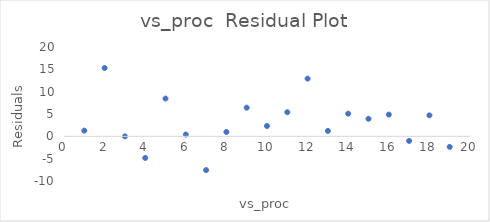
| Category | Series 0 |
|---|---|
| 0 | 1.267 |
| 1 | 15.292 |
| 2 | -0.004 |
| 3 | -4.838 |
| 4 | 8.461 |
| 5 | 0.406 |
| 6 | -7.557 |
| 7 | 0.977 |
| 8 | 6.416 |
| 9 | 2.316 |
| 10 | 5.403 |
| 11 | 12.918 |
| 12 | 1.216 |
| 13 | 5.071 |
| 14 | 3.928 |
| 15 | 4.869 |
| 16 | -1.017 |
| 17 | 4.699 |
| 18 | -2.366 |
| 19 | 8.168 |
| 20 | -16.393 |
| 21 | 6.189 |
| 22 | 11.513 |
| 23 | -1.577 |
| 24 | 5.841 |
| 25 | 10.309 |
| 26 | 4.587 |
| 27 | 3.82 |
| 28 | 0.775 |
| 29 | 11.954 |
| 30 | -0.415 |
| 31 | 9.138 |
| 32 | -8.422 |
| 33 | 1.537 |
| 34 | 3.233 |
| 35 | -6.567 |
| 36 | 12.716 |
| 37 | -0.663 |
| 38 | 1.883 |
| 39 | -1.22 |
| 40 | 11.537 |
| 41 | 7.772 |
| 42 | 6.327 |
| 43 | 0.132 |
| 44 | 1.859 |
| 45 | 5.192 |
| 46 | -4.631 |
| 47 | 7.261 |
| 48 | 4.036 |
| 49 | 13.141 |
| 50 | -6.839 |
| 51 | 4.633 |
| 52 | 7.245 |
| 53 | 1.591 |
| 54 | 9.561 |
| 55 | 3.293 |
| 56 | 12.322 |
| 57 | -13.358 |
| 58 | -17.142 |
| 59 | -2.834 |
| 60 | 0.723 |
| 61 | -2.875 |
| 62 | -4.661 |
| 63 | 3.18 |
| 64 | -6.265 |
| 65 | -3.186 |
| 66 | 4.661 |
| 67 | -0.001 |
| 68 | -7.832 |
| 69 | -10.403 |
| 70 | -12.019 |
| 71 | 1.246 |
| 72 | -6.517 |
| 73 | -7.326 |
| 74 | -0.567 |
| 75 | 8.21 |
| 76 | -2.295 |
| 77 | 1.416 |
| 78 | -4.326 |
| 79 | -4.394 |
| 80 | 14.023 |
| 81 | -7.789 |
| 82 | -3.364 |
| 83 | 7.16 |
| 84 | -2.409 |
| 85 | 6.465 |
| 86 | 0.104 |
| 87 | 11.134 |
| 88 | 1.918 |
| 89 | 4.078 |
| 90 | -0.038 |
| 91 | 2.564 |
| 92 | 4.352 |
| 93 | 0.917 |
| 94 | 2.778 |
| 95 | -14.236 |
| 96 | 18.317 |
| 97 | 2.247 |
| 98 | -8.331 |
| 99 | -1.928 |
| 100 | 0.414 |
| 101 | 2.132 |
| 102 | 1.234 |
| 103 | 9.922 |
| 104 | 3.246 |
| 105 | 7.458 |
| 106 | -2.226 |
| 107 | 2.223 |
| 108 | 7.795 |
| 109 | 1.67 |
| 110 | -1.227 |
| 111 | 4.144 |
| 112 | 1.067 |
| 113 | 11.906 |
| 114 | -0.938 |
| 115 | 1.544 |
| 116 | 7.12 |
| 117 | 8.609 |
| 118 | 16.017 |
| 119 | -0.301 |
| 120 | -2.303 |
| 121 | 7.436 |
| 122 | -3.164 |
| 123 | 1.28 |
| 124 | 9.504 |
| 125 | -1.574 |
| 126 | 2.381 |
| 127 | 5.739 |
| 128 | -1.544 |
| 129 | -3.916 |
| 130 | 7.122 |
| 131 | -1.678 |
| 132 | 4.717 |
| 133 | -3.603 |
| 134 | 4.063 |
| 135 | 0.999 |
| 136 | 2.267 |
| 137 | 3.226 |
| 138 | 14.044 |
| 139 | 3.478 |
| 140 | -1.733 |
| 141 | -6.796 |
| 142 | -7.289 |
| 143 | -13.458 |
| 144 | -0.716 |
| 145 | 11.555 |
| 146 | 0.811 |
| 147 | 5.932 |
| 148 | 0.497 |
| 149 | -16.441 |
| 150 | 0.358 |
| 151 | -13.357 |
| 152 | 1.688 |
| 153 | 1.413 |
| 154 | -0.325 |
| 155 | -8.941 |
| 156 | -8.586 |
| 157 | -6.393 |
| 158 | -4.65 |
| 159 | -8.179 |
| 160 | -10.448 |
| 161 | 13.044 |
| 162 | 2.15 |
| 163 | -12.631 |
| 164 | -2.582 |
| 165 | -5.523 |
| 166 | 2.437 |
| 167 | -24.268 |
| 168 | 2.312 |
| 169 | 8.082 |
| 170 | -1.626 |
| 171 | -9.087 |
| 172 | -5.973 |
| 173 | 4.233 |
| 174 | 1.584 |
| 175 | -4.84 |
| 176 | -8.852 |
| 177 | -3.49 |
| 178 | -11.352 |
| 179 | -8.272 |
| 180 | -2.824 |
| 181 | -5.022 |
| 182 | -4.91 |
| 183 | -7.19 |
| 184 | -0.995 |
| 185 | -3.77 |
| 186 | -18.173 |
| 187 | -17.444 |
| 188 | 3.859 |
| 189 | -8.69 |
| 190 | 8.133 |
| 191 | -7.523 |
| 192 | -1.373 |
| 193 | -7.237 |
| 194 | -8.995 |
| 195 | -0.254 |
| 196 | -12.089 |
| 197 | -3.835 |
| 198 | 5.587 |
| 199 | 7.764 |
| 200 | -3.925 |
| 201 | -9.523 |
| 202 | 1.077 |
| 203 | -11.612 |
| 204 | 3.916 |
| 205 | -0.586 |
| 206 | 1.692 |
| 207 | 1.985 |
| 208 | -4.164 |
| 209 | -23.99 |
| 210 | 1.307 |
| 211 | 1.648 |
| 212 | -0.232 |
| 213 | -5.542 |
| 214 | 2.662 |